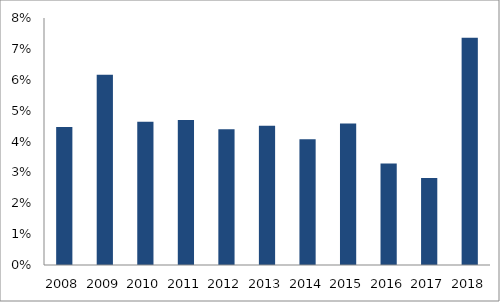
| Category | Series 0 |
|---|---|
| 2008.0 | 0.045 |
| 2009.0 | 0.062 |
| 2010.0 | 0.046 |
| 2011.0 | 0.047 |
| 2012.0 | 0.044 |
| 2013.0 | 0.045 |
| 2014.0 | 0.041 |
| 2015.0 | 0.046 |
| 2016.0 | 0.033 |
| 2017.0 | 0.028 |
| 2018.0 | 0.074 |